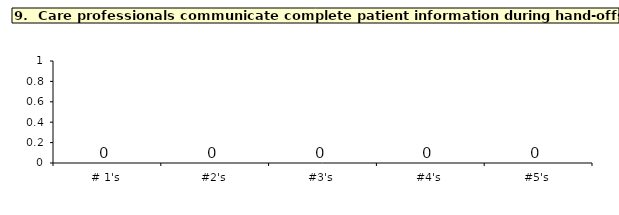
| Category | Q_9 |
|---|---|
| # 1's | 0 |
| #2's | 0 |
| #3's | 0 |
| #4's | 0 |
| #5's | 0 |